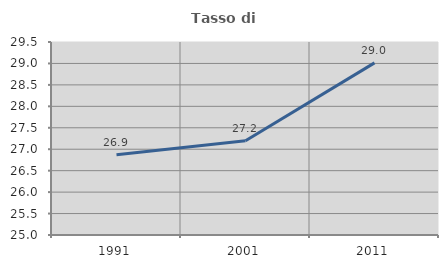
| Category | Tasso di occupazione   |
|---|---|
| 1991.0 | 26.872 |
| 2001.0 | 27.199 |
| 2011.0 | 29.014 |